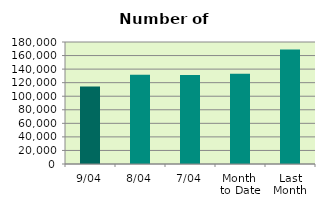
| Category | Series 0 |
|---|---|
| 9/04 | 114288 |
| 8/04 | 131708 |
| 7/04 | 131200 |
| Month 
to Date | 133051.6 |
| Last
Month | 168827.304 |